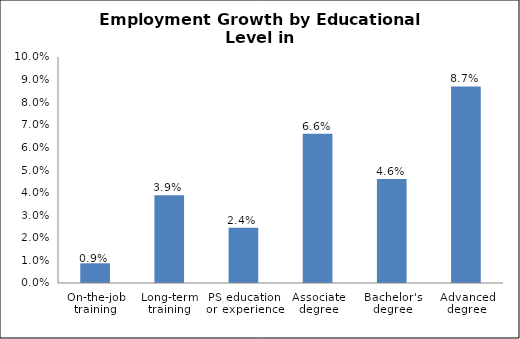
| Category | Series 0 |
|---|---|
| On-the-job training | 0.009 |
| Long-term training | 0.039 |
| PS education or experience | 0.024 |
| Associate degree | 0.066 |
| Bachelor's degree | 0.046 |
| Advanced degree | 0.087 |